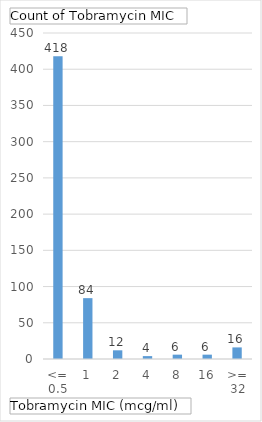
| Category | Total |
|---|---|
| <= 0.5 | 418 |
| 1 | 84 |
| 2 | 12 |
| 4 | 4 |
| 8 | 6 |
| 16 | 6 |
| >= 32 | 16 |